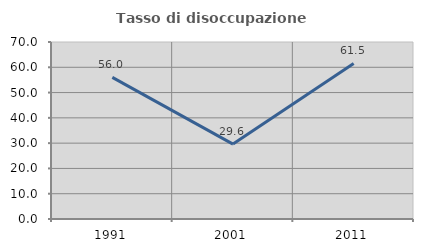
| Category | Tasso di disoccupazione giovanile  |
|---|---|
| 1991.0 | 56 |
| 2001.0 | 29.63 |
| 2011.0 | 61.538 |